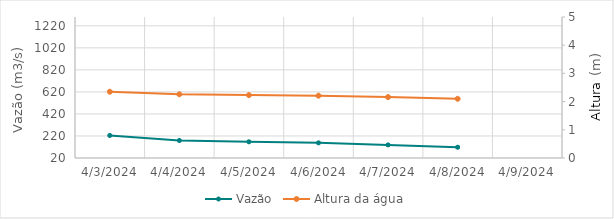
| Category | Vazão |
|---|---|
| 10/30/23 | 36.75 |
| 10/29/23 | 33.81 |
| 10/28/23 | 36.07 |
| 10/27/23 | 40.03 |
| 10/26/23 | 40.21 |
| 10/25/23 | 41.06 |
| 10/24/23 | 42.8 |